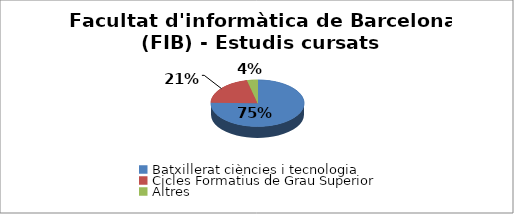
| Category | Facultat d'informàtica de Barcelona (FIB) - Estudis cursats |
|---|---|
| Batxillerat ciències i tecnologia | 0.754 |
| Cicles Formatius de Grau Superior | 0.21 |
| Altres | 0.036 |